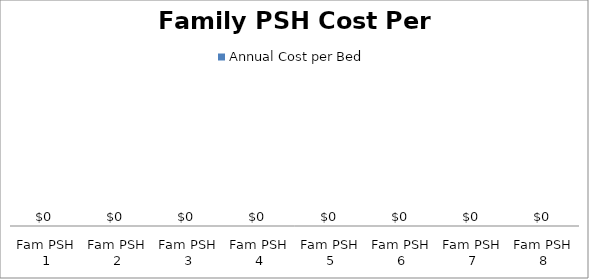
| Category | Annual Cost per Bed |
|---|---|
| Fam PSH 1 | 0 |
| Fam PSH 2 | 0 |
| Fam PSH 3 | 0 |
| Fam PSH 4 | 0 |
| Fam PSH 5 | 0 |
| Fam PSH 6 | 0 |
| Fam PSH 7 | 0 |
| Fam PSH 8 | 0 |